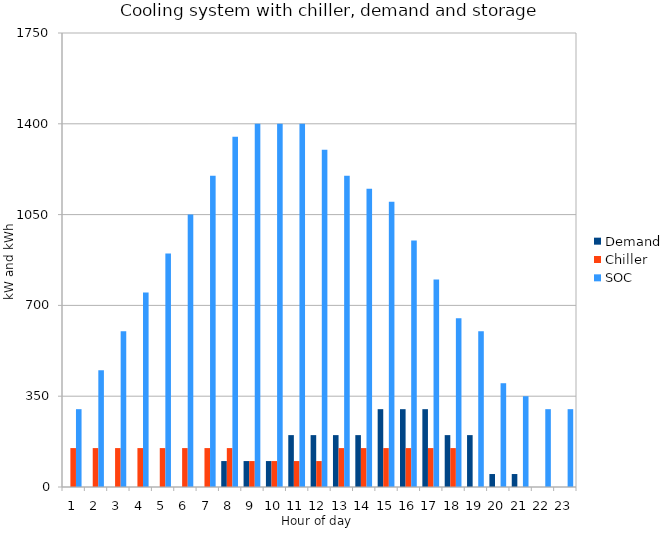
| Category | Demand | Chiller | SOC |
|---|---|---|---|
| 1 | 0 | 150 | 300 |
| 2 | 0 | 150 | 450 |
| 3 | 0 | 150 | 600 |
| 4 | 0 | 150 | 750 |
| 5 | 0 | 150 | 900 |
| 6 | 0 | 150 | 1050 |
| 7 | 0 | 150 | 1200 |
| 8 | 100 | 150 | 1350 |
| 9 | 100 | 100 | 1400 |
| 10 | 100 | 100 | 1400 |
| 11 | 200 | 100 | 1400 |
| 12 | 200 | 100 | 1300 |
| 13 | 200 | 150 | 1200 |
| 14 | 200 | 150 | 1150 |
| 15 | 300 | 150 | 1100 |
| 16 | 300 | 150 | 950 |
| 17 | 300 | 150 | 800 |
| 18 | 200 | 150 | 650 |
| 19 | 200 | 0 | 600 |
| 20 | 50 | 0 | 400 |
| 21 | 50 | 0 | 350 |
| 22 | 0 | 0 | 300 |
| 23 | 0 | 0 | 300 |